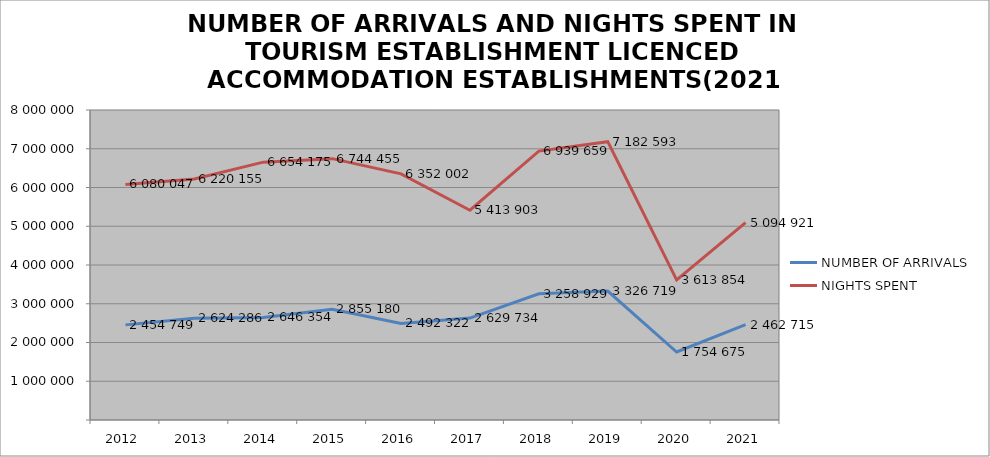
| Category | NUMBER OF ARRIVALS | NIGHTS SPENT |
|---|---|---|
| 2012 | 2454749 | 6080047 |
| 2013 | 2624286 | 6220155 |
| 2014 | 2646354 | 6654175 |
| 2015 | 2855180 | 6744455 |
| 2016 | 2492322 | 6352002 |
| 2017 | 2629734 | 5413903 |
| 2018 | 3258929 | 6939659 |
| 2019 | 3326719 | 7182593 |
| 2020 | 1754675 | 3613854 |
| 2021 | 2462715 | 5094921 |